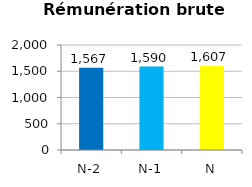
| Category | Rémunération brute moyenne |
|---|---|
| N-2 | 1567 |
| N-1 | 1590 |
| N | 1607 |